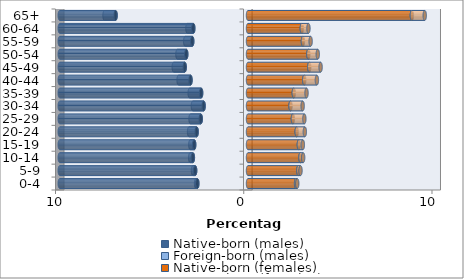
| Category | Native-born (males) | Foreign-born (males) | Native-born (females) | Foreign-born (females) |
|---|---|---|---|---|
| 0-4 | -2.692 | -0.066 | 2.553 | 0.063 |
| 5-9 | -2.808 | -0.116 | 2.674 | 0.115 |
| 10-14 | -2.929 | -0.142 | 2.785 | 0.145 |
| 15-19 | -2.858 | -0.206 | 2.702 | 0.212 |
| 20-24 | -2.728 | -0.403 | 2.587 | 0.432 |
| 25-29 | -2.509 | -0.544 | 2.385 | 0.609 |
| 30-34 | -2.357 | -0.57 | 2.26 | 0.644 |
| 35-39 | -2.491 | -0.607 | 2.432 | 0.676 |
| 40-44 | -3.054 | -0.633 | 2.987 | 0.672 |
| 45-49 | -3.362 | -0.583 | 3.254 | 0.603 |
| 50-54 | -3.279 | -0.47 | 3.205 | 0.501 |
| 55-59 | -2.962 | -0.373 | 2.918 | 0.409 |
| 60-64 | -2.907 | -0.312 | 2.859 | 0.352 |
| 65+ | -7.034 | -0.587 | 8.705 | 0.684 |